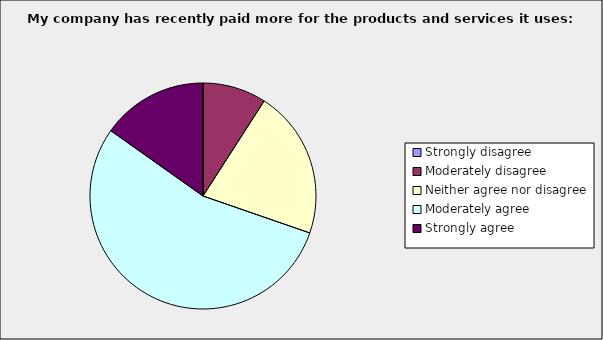
| Category | Series 0 |
|---|---|
| Strongly disagree | 0 |
| Moderately disagree | 0.091 |
| Neither agree nor disagree | 0.212 |
| Moderately agree | 0.545 |
| Strongly agree | 0.152 |